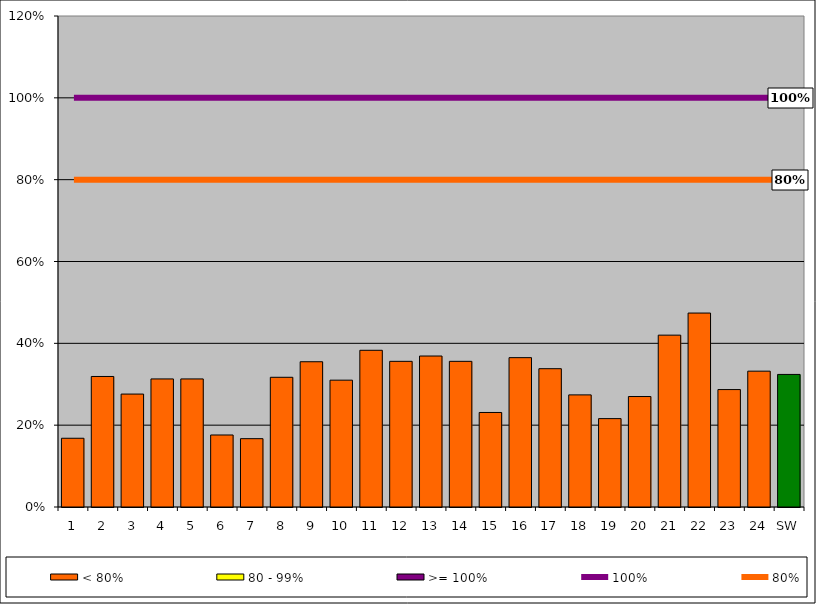
| Category | < 80% | 80 - 99% | >= 100% |
|---|---|---|---|
| 1 | 0.168 | 0 | 0 |
| 2 | 0.319 | 0 | 0 |
| 3 | 0.276 | 0 | 0 |
| 4 | 0.313 | 0 | 0 |
| 5 | 0.313 | 0 | 0 |
| 6 | 0.176 | 0 | 0 |
| 7 | 0.167 | 0 | 0 |
| 8 | 0.317 | 0 | 0 |
| 9 | 0.355 | 0 | 0 |
| 10 | 0.31 | 0 | 0 |
| 11 | 0.383 | 0 | 0 |
| 12 | 0.356 | 0 | 0 |
| 13 | 0.369 | 0 | 0 |
| 14 | 0.356 | 0 | 0 |
| 15 | 0.231 | 0 | 0 |
| 16 | 0.365 | 0 | 0 |
| 17 | 0.338 | 0 | 0 |
| 18 | 0.274 | 0 | 0 |
| 19 | 0.216 | 0 | 0 |
| 20 | 0.27 | 0 | 0 |
| 21 | 0.42 | 0 | 0 |
| 22 | 0.474 | 0 | 0 |
| 23 | 0.287 | 0 | 0 |
| 24 | 0.332 | 0 | 0 |
| SW | 0.324 | 0 | 0 |